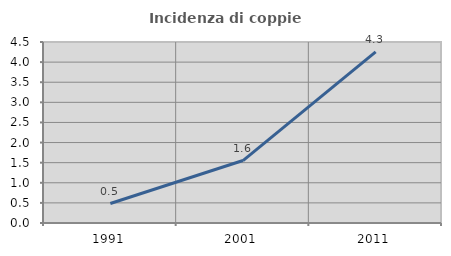
| Category | Incidenza di coppie miste |
|---|---|
| 1991.0 | 0.485 |
| 2001.0 | 1.553 |
| 2011.0 | 4.254 |